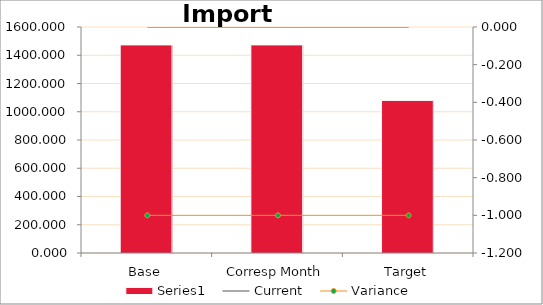
| Category | Series 0 |
|---|---|
| Base | 1473.237 |
| Corresp Month | 1473.237 |
| Target | 1080.374 |